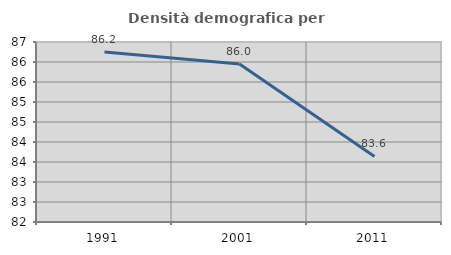
| Category | Densità demografica |
|---|---|
| 1991.0 | 86.248 |
| 2001.0 | 85.952 |
| 2011.0 | 83.64 |